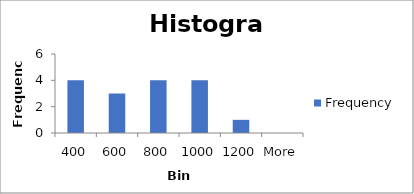
| Category | Frequency |
|---|---|
| 400 | 4 |
| 600 | 3 |
| 800 | 4 |
| 1000 | 4 |
| 1200 | 1 |
| More | 0 |